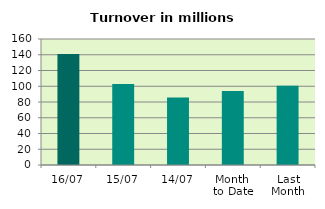
| Category | Series 0 |
|---|---|
| 16/07 | 140.795 |
| 15/07 | 102.832 |
| 14/07 | 85.585 |
| Month 
to Date | 94.087 |
| Last
Month | 100.537 |